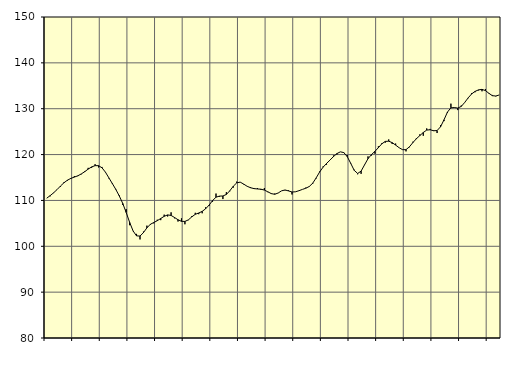
| Category | Piggar | Samtliga anställda (inkl. anställda utomlands) |
|---|---|---|
| nan | 110.5 | 110.49 |
| 87.0 | 110.9 | 111.05 |
| 87.0 | 111.6 | 111.67 |
| 87.0 | 112.4 | 112.37 |
| nan | 113 | 113.15 |
| 88.0 | 114 | 113.86 |
| 88.0 | 114.3 | 114.42 |
| 88.0 | 114.7 | 114.81 |
| nan | 115.3 | 115.09 |
| 89.0 | 115.3 | 115.37 |
| 89.0 | 115.7 | 115.78 |
| 89.0 | 116.4 | 116.27 |
| nan | 117.1 | 116.83 |
| 90.0 | 117.1 | 117.31 |
| 90.0 | 117.9 | 117.58 |
| 90.0 | 117.2 | 117.58 |
| nan | 117.3 | 117.11 |
| 91.0 | 116.1 | 116.16 |
| 91.0 | 114.8 | 114.91 |
| 91.0 | 113.8 | 113.67 |
| nan | 112.5 | 112.4 |
| 92.0 | 111.1 | 110.98 |
| 92.0 | 109 | 109.35 |
| 92.0 | 108.1 | 107.38 |
| nan | 104.6 | 105.23 |
| 93.0 | 103.3 | 103.35 |
| 93.0 | 102.7 | 102.27 |
| 93.0 | 101.5 | 102.23 |
| nan | 103.2 | 102.98 |
| 94.0 | 104.5 | 104.02 |
| 94.0 | 104.7 | 104.8 |
| 94.0 | 105 | 105.19 |
| nan | 105.8 | 105.58 |
| 95.0 | 105.7 | 106.06 |
| 95.0 | 106.9 | 106.53 |
| 95.0 | 106.5 | 106.84 |
| nan | 107.4 | 106.73 |
| 96.0 | 106.1 | 106.28 |
| 96.0 | 105.4 | 105.79 |
| 96.0 | 106.1 | 105.44 |
| nan | 104.8 | 105.42 |
| 97.0 | 105.7 | 105.76 |
| 97.0 | 106.6 | 106.42 |
| 97.0 | 107.3 | 106.97 |
| nan | 107 | 107.26 |
| 98.0 | 107.2 | 107.61 |
| 98.0 | 108.5 | 108.18 |
| 98.0 | 108.8 | 108.98 |
| nan | 109.7 | 109.96 |
| 99.0 | 111.5 | 110.71 |
| 99.0 | 110.8 | 110.94 |
| 99.0 | 110.3 | 110.97 |
| nan | 111.8 | 111.3 |
| 0.0 | 112 | 112.11 |
| 0.0 | 112.8 | 113.09 |
| 0.0 | 114.1 | 113.83 |
| nan | 114 | 113.99 |
| 1.0 | 113.5 | 113.57 |
| 1.0 | 113.1 | 113.09 |
| 1.0 | 112.9 | 112.77 |
| nan | 112.5 | 112.58 |
| 2.0 | 112.7 | 112.5 |
| 2.0 | 112.3 | 112.45 |
| 2.0 | 112.7 | 112.26 |
| nan | 111.8 | 111.88 |
| 3.0 | 111.4 | 111.49 |
| 3.0 | 111.5 | 111.34 |
| 3.0 | 111.6 | 111.62 |
| nan | 112.1 | 112.1 |
| 4.0 | 112.2 | 112.28 |
| 4.0 | 112.2 | 112.07 |
| 4.0 | 111.3 | 111.84 |
| nan | 111.9 | 111.88 |
| 5.0 | 112.1 | 112.12 |
| 5.0 | 112.4 | 112.4 |
| 5.0 | 112.8 | 112.66 |
| nan | 113.1 | 113.04 |
| 6.0 | 113.6 | 113.76 |
| 6.0 | 114.8 | 114.92 |
| 6.0 | 116.3 | 116.2 |
| nan | 117.4 | 117.25 |
| 7.0 | 117.8 | 118.06 |
| 7.0 | 118.8 | 118.8 |
| 7.0 | 119.8 | 119.56 |
| nan | 120 | 120.21 |
| 8.0 | 120.6 | 120.6 |
| 8.0 | 120.5 | 120.43 |
| 8.0 | 119.9 | 119.54 |
| nan | 118 | 118.09 |
| 9.0 | 116.7 | 116.57 |
| 9.0 | 115.7 | 115.88 |
| 9.0 | 115.8 | 116.39 |
| nan | 117.8 | 117.75 |
| 10.0 | 119.6 | 119.1 |
| 10.0 | 119.8 | 119.99 |
| 10.0 | 120.2 | 120.7 |
| nan | 121.8 | 121.5 |
| 11.0 | 122.5 | 122.34 |
| 11.0 | 122.6 | 122.87 |
| 11.0 | 123.3 | 122.92 |
| nan | 122.3 | 122.6 |
| 12.0 | 122.4 | 122.07 |
| 12.0 | 121.5 | 121.5 |
| 12.0 | 121.1 | 121.07 |
| nan | 120.7 | 121.07 |
| 13.0 | 121.6 | 121.7 |
| 13.0 | 122.8 | 122.62 |
| 13.0 | 123.6 | 123.45 |
| nan | 124.4 | 124.14 |
| 14.0 | 124.1 | 124.81 |
| 14.0 | 125.7 | 125.34 |
| 14.0 | 125.6 | 125.41 |
| nan | 125.3 | 125.19 |
| 15.0 | 124.7 | 125.24 |
| 15.0 | 126.4 | 126.05 |
| 15.0 | 127.3 | 127.58 |
| nan | 129.1 | 129.27 |
| 16.0 | 131.1 | 130.19 |
| 16.0 | 130.3 | 130.26 |
| 16.0 | 129.7 | 130.14 |
| nan | 130.7 | 130.5 |
| 17.0 | 131.4 | 131.37 |
| 17.0 | 132.3 | 132.37 |
| 17.0 | 133.4 | 133.22 |
| nan | 133.6 | 133.78 |
| 18.0 | 134 | 134.11 |
| 18.0 | 133.8 | 134.22 |
| 18.0 | 134.3 | 133.95 |
| nan | 133.3 | 133.36 |
| 19.0 | 133 | 132.84 |
| 19.0 | 132.7 | 132.77 |
| 19.0 | 133 | 133 |